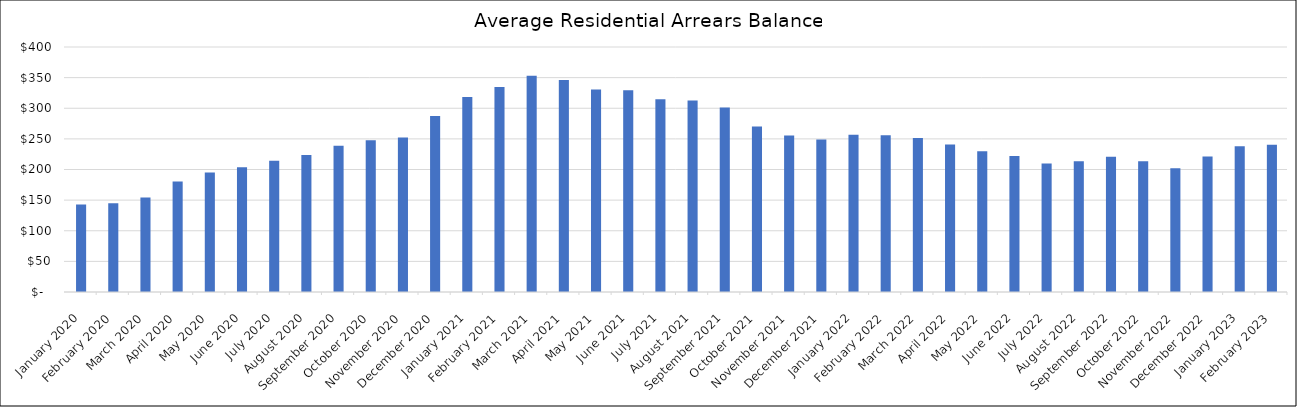
| Category | Average Arrears Balance |
|---|---|
| 2020-01-01 | 142.913 |
| 2020-02-01 | 145.033 |
| 2020-03-01 | 154.464 |
| 2020-04-01 | 180.508 |
| 2020-05-01 | 195.168 |
| 2020-06-01 | 203.835 |
| 2020-07-01 | 214.105 |
| 2020-08-01 | 223.613 |
| 2020-09-01 | 238.676 |
| 2020-10-01 | 247.849 |
| 2020-11-01 | 252.444 |
| 2020-12-01 | 287.45 |
| 2021-01-01 | 318.532 |
| 2021-02-01 | 334.791 |
| 2021-03-01 | 353.141 |
| 2021-04-01 | 346.301 |
| 2021-05-01 | 330.772 |
| 2021-06-01 | 329.537 |
| 2021-07-01 | 314.602 |
| 2021-08-01 | 312.492 |
| 2021-09-01 | 301.239 |
| 2021-10-01 | 270.246 |
| 2021-11-01 | 255.669 |
| 2021-12-01 | 249.121 |
| 2022-01-01 | 256.797 |
| 2022-02-01 | 255.896 |
| 2022-03-01 | 251.319 |
| 2022-04-01 | 240.958 |
| 2022-05-01 | 229.727 |
| 2022-06-01 | 222.05 |
| 2022-07-01 | 209.773 |
| 2022-08-01 | 213.356 |
| 2022-09-01 | 220.643 |
| 2022-10-01 | 213.577 |
| 2022-11-01 | 201.851 |
| 2022-12-01 | 221.09 |
| 2023-01-01 | 237.776 |
| 2023-02-01 | 240.348 |